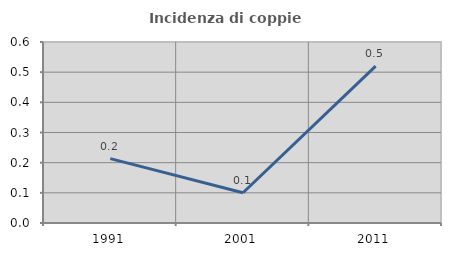
| Category | Incidenza di coppie miste |
|---|---|
| 1991.0 | 0.213 |
| 2001.0 | 0.1 |
| 2011.0 | 0.52 |